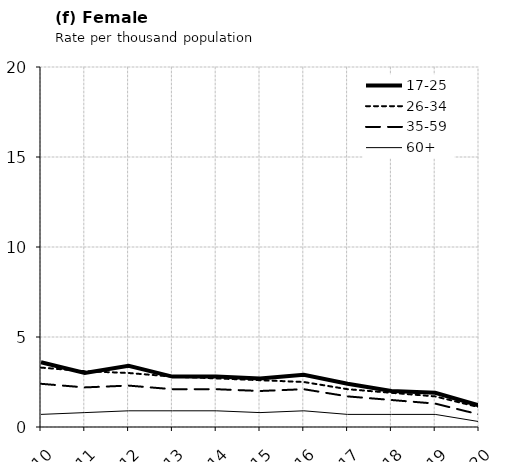
| Category | 17-25 | 26-34 | 35-59 | 60+ |
|---|---|---|---|---|
| 2010.0 | 3.6 | 3.3 | 2.4 | 0.7 |
| 2011.0 | 3 | 3.1 | 2.2 | 0.8 |
| 2012.0 | 3.4 | 3 | 2.3 | 0.9 |
| 2013.0 | 2.8 | 2.8 | 2.1 | 0.9 |
| 2014.0 | 2.8 | 2.7 | 2.1 | 0.9 |
| 2015.0 | 2.7 | 2.6 | 2 | 0.8 |
| 2016.0 | 2.9 | 2.5 | 2.1 | 0.9 |
| 2017.0 | 2.4 | 2.1 | 1.7 | 0.7 |
| 2018.0 | 2 | 1.9 | 1.5 | 0.7 |
| 2019.0 | 1.9 | 1.7 | 1.3 | 0.7 |
| 2020.0 | 1.2 | 1.1 | 0.7 | 0.3 |